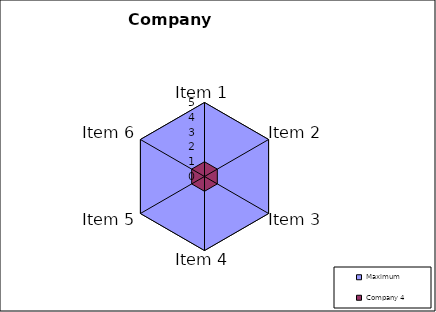
| Category | Maximum | Company 4 |
|---|---|---|
| Item 1 | 5 | 1 |
| Item 2 | 5 | 1 |
| Item 3 | 5 | 1 |
| Item 4 | 5 | 1 |
| Item 5 | 5 | 1 |
| Item 6 | 5 | 1 |